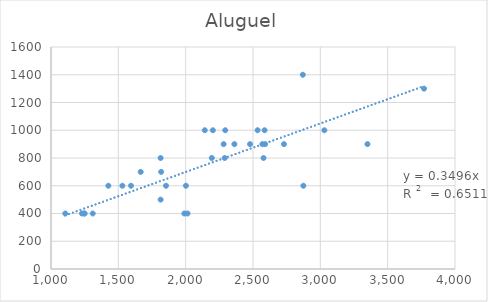
| Category | Aluguel |
|---|---|
| 2202.0 | 1000 |
| 1310.0 | 400 |
| 2194.0 | 800 |
| 1106.0 | 400 |
| 1814.0 | 500 |
| 2002.0 | 600 |
| 2362.0 | 900 |
| 1230.0 | 400 |
| 2586.0 | 1000 |
| 1854.0 | 600 |
| 2534.0 | 1000 |
| 2570.0 | 900 |
| 1246.0 | 400 |
| 1990.0 | 400 |
| 1594.0 | 600 |
| 2578.0 | 800 |
| 1530.0 | 600 |
| 2478.0 | 900 |
| 1666.0 | 700 |
| 2282.0 | 900 |
| 2142.0 | 1000 |
| 3030.0 | 1000 |
| 2590.0 | 900 |
| 2874.0 | 600 |
| 2014.0 | 400 |
| 3350.0 | 900 |
| 1250.0 | 400 |
| 2870.0 | 1400 |
| 1814.0 | 800 |
| 3770.0 | 1300 |
| 2294.0 | 1000 |
| 2730.0 | 900 |
| 2290.0 | 800 |
| 1818.0 | 700 |
| 1426.0 | 600 |